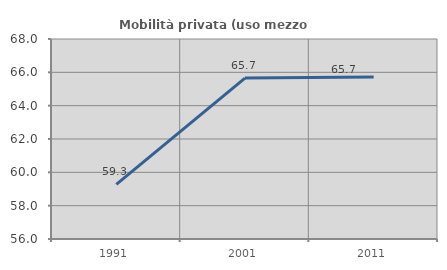
| Category | Mobilità privata (uso mezzo privato) |
|---|---|
| 1991.0 | 59.279 |
| 2001.0 | 65.656 |
| 2011.0 | 65.724 |